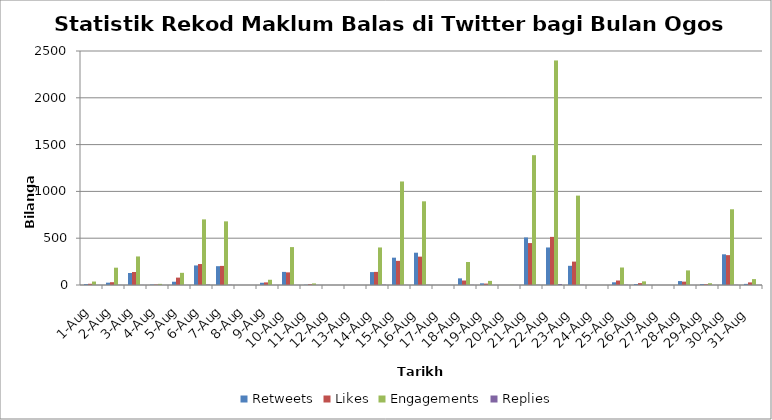
| Category | Retweets | Likes | Engagements | Replies |
|---|---|---|---|---|
| 2017-08-01 | 11 | 13 | 37 | 0 |
| 2017-08-02 | 25 | 30 | 185 | 1 |
| 2017-08-03 | 128 | 139 | 305 | 1 |
| 2017-08-04 | 5 | 5 | 12 | 0 |
| 2017-08-05 | 35 | 79 | 130 | 0 |
| 2017-08-06 | 209 | 224 | 701 | 5 |
| 2017-08-07 | 201 | 204 | 680 | 2 |
| 2017-08-08 | 0 | 0 | 0 | 0 |
| 2017-08-09 | 24 | 28 | 56 | 0 |
| 2017-08-10 | 140 | 135 | 405 | 0 |
| 2017-08-11 | 3 | 8 | 17 | 0 |
| 2017-08-12 | 0 | 0 | 0 | 0 |
| 2017-08-13 | 0 | 0 | 0 | 0 |
| 2017-08-14 | 138 | 140 | 401 | 4 |
| 2017-08-15 | 292 | 258 | 1106 | 1 |
| 2017-08-16 | 345 | 303 | 894 | 2 |
| 2017-08-17 | 0 | 0 | 0 | 0 |
| 2017-08-18 | 71 | 48 | 246 | 2 |
| 2017-08-19 | 18 | 15 | 44 | 0 |
| 2017-08-20 | 0 | 0 | 2 | 1 |
| 2017-08-21 | 508 | 448 | 1387 | 2 |
| 2017-08-22 | 401 | 514 | 2399 | 11 |
| 2017-08-23 | 205 | 250 | 955 | 2 |
| 2017-08-24 | 0 | 0 | 0 | 0 |
| 2017-08-25 | 29 | 48 | 187 | 3 |
| 2017-08-26 | 11 | 20 | 39 | 0 |
| 2017-08-27 | 0 | 0 | 0 | 0 |
| 2017-08-28 | 42 | 36 | 156 | 0 |
| 2017-08-29 | 10 | 8 | 19 | 0 |
| 2017-08-30 | 328 | 319 | 809 | 2 |
| 2017-08-31 | 12 | 28 | 63 | 0 |